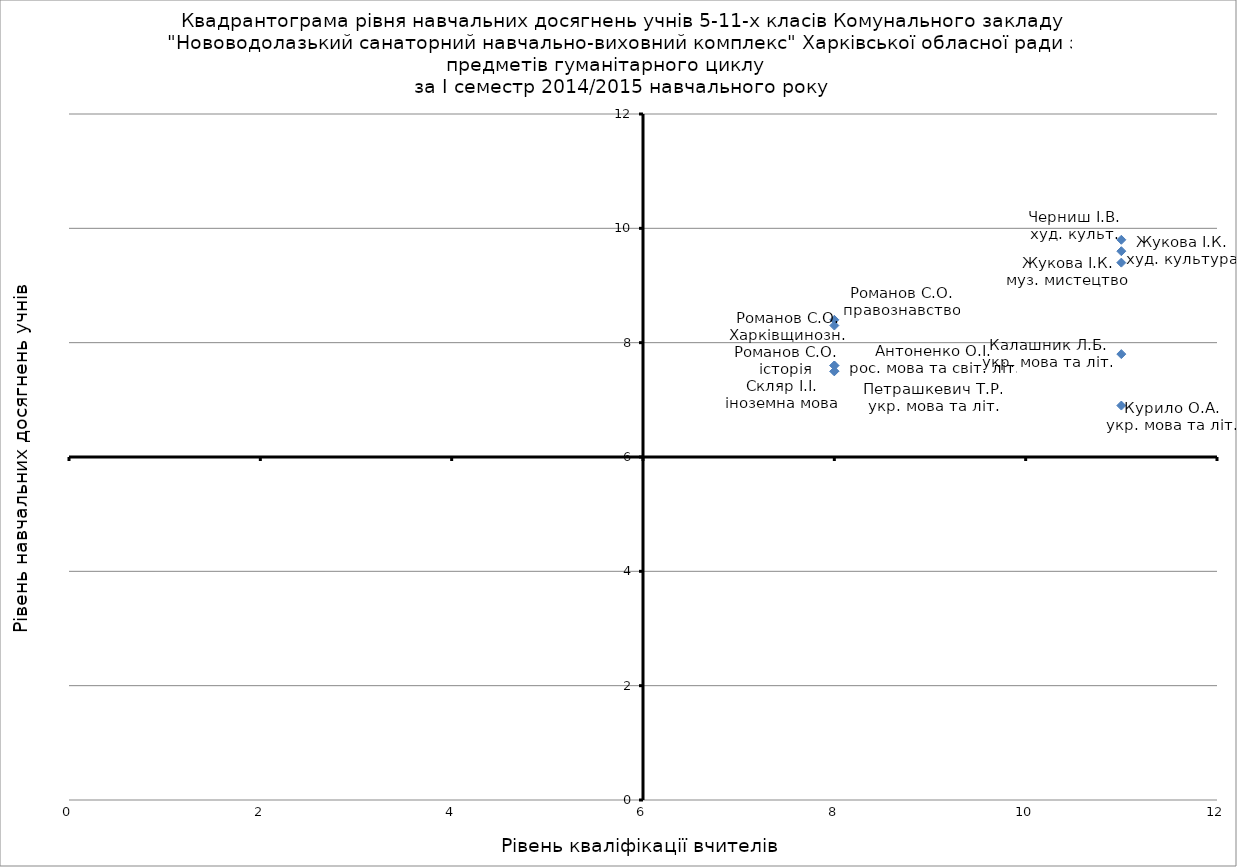
| Category | Series 0 |
|---|---|
| 11.0 | 7.8 |
| 11.0 | 6.9 |
| 8.0 | 7.6 |
| 8.0 | 7.5 |
| 8.0 | 7.5 |
| 11.0 | 9.4 |
| 8.0 | 7.6 |
| 8.0 | 8.4 |
| 8.0 | 8.3 |
| 11.0 | 9.6 |
| 11.0 | 9.8 |